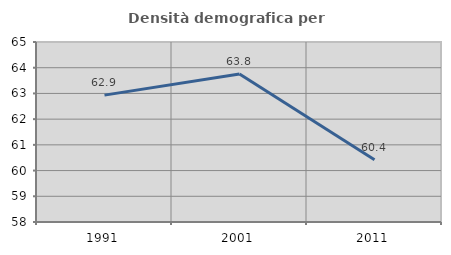
| Category | Densità demografica |
|---|---|
| 1991.0 | 62.934 |
| 2001.0 | 63.757 |
| 2011.0 | 60.42 |